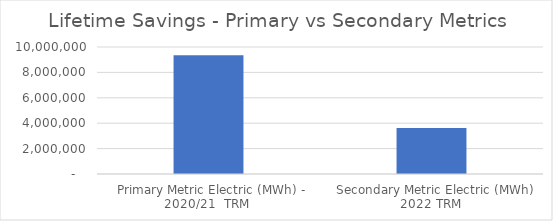
| Category | Series 0 |
|---|---|
| Primary Metric Electric (MWh) - 2020/21  TRM | 9360228.733 |
| Secondary Metric Electric (MWh) 2022 TRM | 3625802.11 |